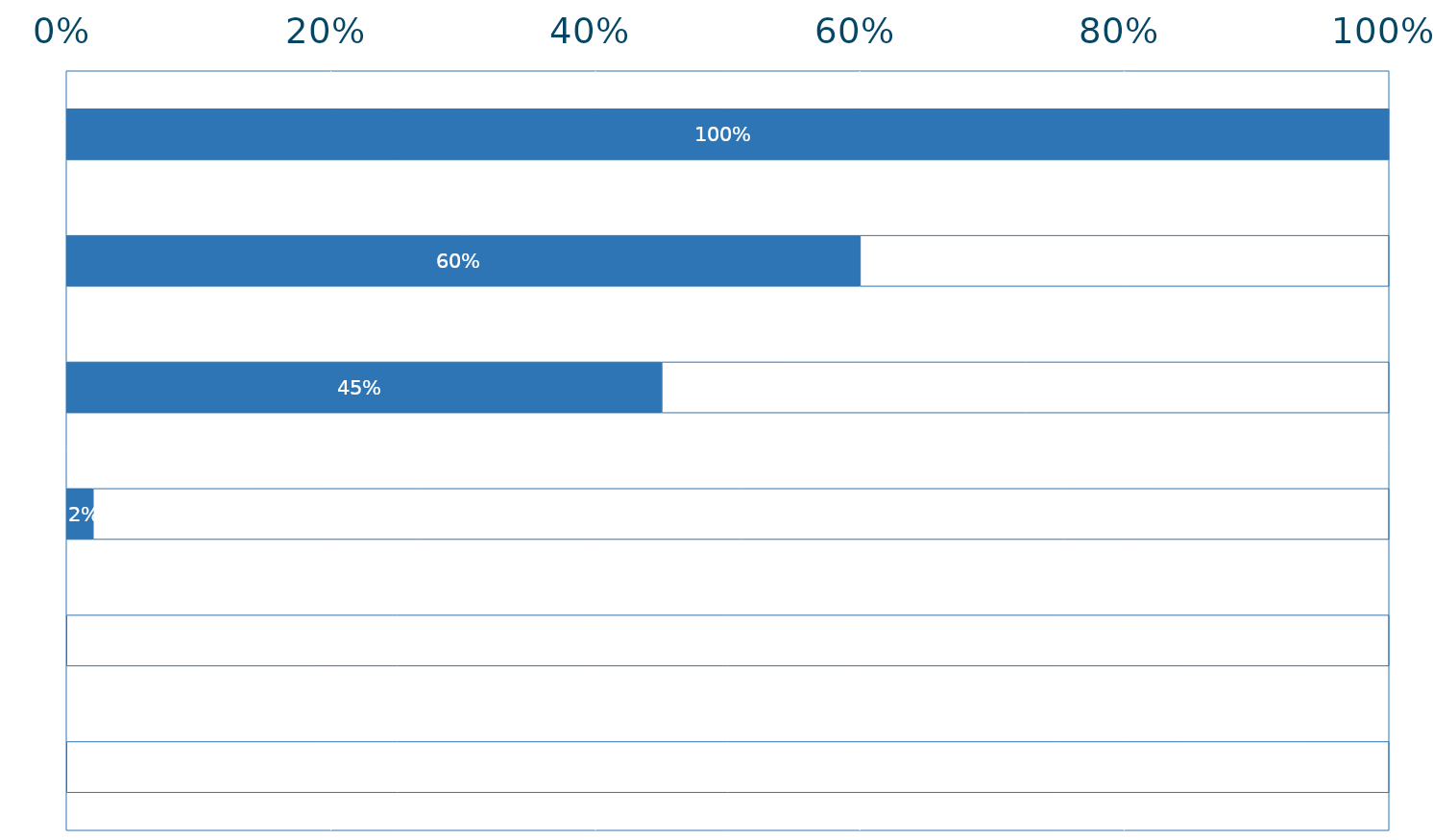
| Category | Series 0 | Series 1 |
|---|---|---|
| 0 | 1 | 0 |
| 1 | 0.6 | 0.4 |
| 2 | 0.45 | 0.55 |
| 3 | 0.02 | 0.98 |
| 4 | 0 | 1 |
| 5 | 0 | 1 |